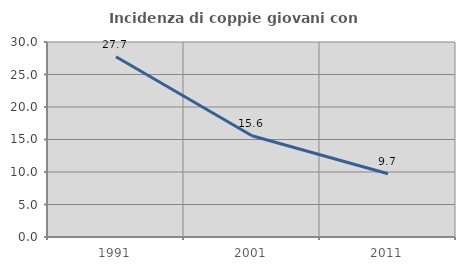
| Category | Incidenza di coppie giovani con figli |
|---|---|
| 1991.0 | 27.722 |
| 2001.0 | 15.585 |
| 2011.0 | 9.735 |